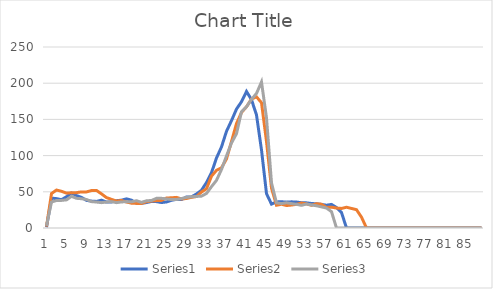
| Category | Series 0 | Series 1 | Series 2 |
|---|---|---|---|
| 0 | 1 | 2 | 3 |
| 1 | 41.286 | 47.571 | 35.857 |
| 2 | 40.571 | 52.429 | 38 |
| 3 | 39.143 | 50.714 | 38.143 |
| 4 | 43.143 | 48.143 | 38.857 |
| 5 | 48.286 | 48.714 | 43.714 |
| 6 | 44.714 | 48.857 | 41 |
| 7 | 42.286 | 49.857 | 40.429 |
| 8 | 38.143 | 49.857 | 39.429 |
| 9 | 37.143 | 51.714 | 36.429 |
| 10 | 36.714 | 51.857 | 35.857 |
| 11 | 38.429 | 47.143 | 35 |
| 12 | 35.857 | 42 | 35.857 |
| 13 | 36 | 39.571 | 36.429 |
| 14 | 37.714 | 37.286 | 35 |
| 15 | 38.429 | 38 | 36 |
| 16 | 40.286 | 35.857 | 36.286 |
| 17 | 38.429 | 34.286 | 36.143 |
| 18 | 34 | 34 | 37.714 |
| 19 | 34.143 | 33.857 | 35.429 |
| 20 | 35.143 | 36.286 | 37.571 |
| 21 | 36.714 | 37.286 | 38 |
| 22 | 36.429 | 37.857 | 41 |
| 23 | 35.143 | 38.143 | 41 |
| 24 | 36 | 41.429 | 40.143 |
| 25 | 38.286 | 41.714 | 39.286 |
| 26 | 39.571 | 42.286 | 39.286 |
| 27 | 39.286 | 40.143 | 40.714 |
| 28 | 42.857 | 40.714 | 42.286 |
| 29 | 43 | 42.429 | 43.143 |
| 30 | 47 | 43.429 | 43.571 |
| 31 | 52.143 | 49.714 | 44 |
| 32 | 62.857 | 54.286 | 47.714 |
| 33 | 76.429 | 71.571 | 57.143 |
| 34 | 96.714 | 79.714 | 65.857 |
| 35 | 112 | 83.143 | 80.857 |
| 36 | 133.571 | 95.429 | 99.571 |
| 37 | 148.286 | 119.429 | 117.429 |
| 38 | 164.286 | 144.286 | 130.286 |
| 39 | 174.429 | 159.571 | 160.571 |
| 40 | 188.571 | 167.429 | 167.429 |
| 41 | 177.286 | 178.143 | 177.714 |
| 42 | 156.143 | 181.143 | 185.857 |
| 43 | 107.857 | 173 | 201.714 |
| 44 | 47.429 | 119.429 | 152.286 |
| 45 | 33 | 55.143 | 62.429 |
| 46 | 36 | 31.429 | 34.714 |
| 47 | 36.286 | 32.857 | 33.714 |
| 48 | 35.714 | 31 | 34.857 |
| 49 | 36.143 | 31.714 | 33.714 |
| 50 | 35.857 | 32.714 | 32.714 |
| 51 | 34.857 | 34.429 | 31.286 |
| 52 | 34.714 | 33.286 | 33.143 |
| 53 | 33.857 | 31.286 | 31.857 |
| 54 | 33.429 | 33.571 | 30.714 |
| 55 | 32.571 | 32.857 | 29.143 |
| 56 | 31.429 | 28.429 | 27.571 |
| 57 | 32.571 | 28.714 | 22.571 |
| 58 | 28.286 | 27.571 | 0 |
| 59 | 21.429 | 27 | 0 |
| 60 | 0 | 28.714 | 0 |
| 61 | 0 | 27 | 0 |
| 62 | 0 | 25.286 | 0 |
| 63 | 0 | 15 | 0 |
| 64 | 0 | 0 | 0 |
| 65 | 0 | 0 | 0 |
| 66 | 0 | 0 | 0 |
| 67 | 0 | 0 | 0 |
| 68 | 0 | 0 | 0 |
| 69 | 0 | 0 | 0 |
| 70 | 0 | 0 | 0 |
| 71 | 0 | 0 | 0 |
| 72 | 0 | 0 | 0 |
| 73 | 0 | 0 | 0 |
| 74 | 0 | 0 | 0 |
| 75 | 0 | 0 | 0 |
| 76 | 0 | 0 | 0 |
| 77 | 0 | 0 | 0 |
| 78 | 0 | 0 | 0 |
| 79 | 0 | 0 | 0 |
| 80 | 0 | 0 | 0 |
| 81 | 0 | 0 | 0 |
| 82 | 0 | 0 | 0 |
| 83 | 0 | 0 | 0 |
| 84 | 0 | 0 | 0 |
| 85 | 0 | 0 | 0 |
| 86 | 0 | 0 | 0 |
| 87 | 0 | 0 | 0 |